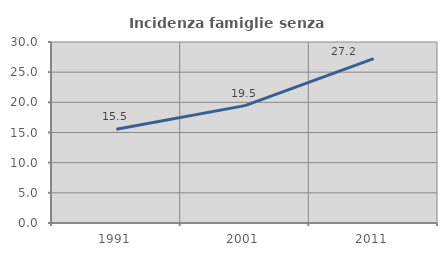
| Category | Incidenza famiglie senza nuclei |
|---|---|
| 1991.0 | 15.526 |
| 2001.0 | 19.456 |
| 2011.0 | 27.239 |